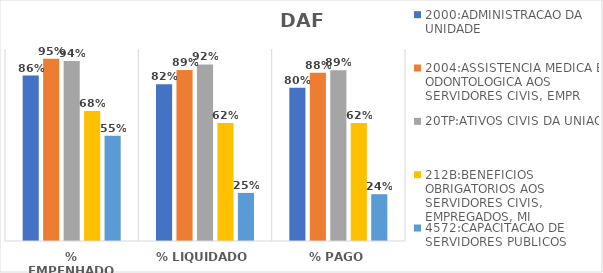
| Category | 2000:ADMINISTRACAO DA UNIDADE | 2004:ASSISTENCIA MEDICA E ODONTOLOGICA AOS SERVIDORES CIVIS, EMPR | 20TP:ATIVOS CIVIS DA UNIAO | 212B:BENEFICIOS OBRIGATORIOS AOS SERVIDORES CIVIS, EMPREGADOS, MI | 4572:CAPACITACAO DE SERVIDORES PUBLICOS FEDERAIS EM PROCESSO DE Q |
|---|---|---|---|---|---|
| % EMPENHADO | 0.862 | 0.949 | 0.938 | 0.677 | 0.548 |
| % LIQUIDADO | 0.816 | 0.891 | 0.92 | 0.615 | 0.251 |
| % PAGO | 0.798 | 0.876 | 0.889 | 0.615 | 0.244 |